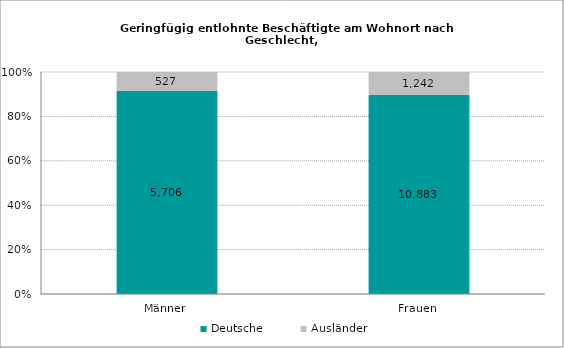
| Category | Deutsche | Ausländer |
|---|---|---|
| Männer | 5706 | 527 |
| Frauen | 10883 | 1242 |